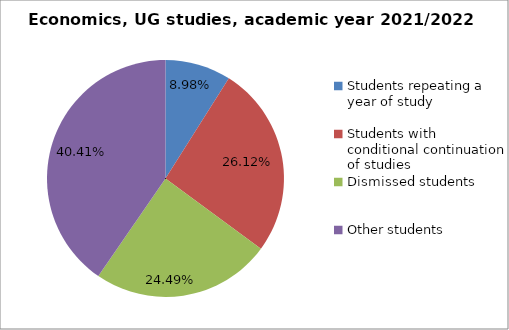
| Category | Series 0 |
|---|---|
| Students repeating a year of study | 22 |
| Students with conditional continuation of studies | 64 |
| Dismissed students | 60 |
| Other students | 99 |